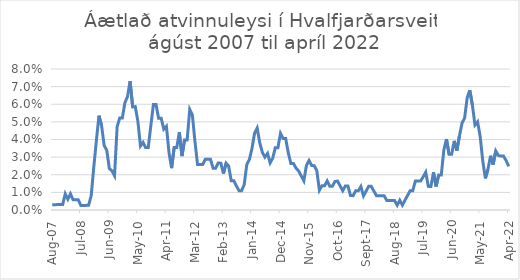
| Category | Áætlað atvinnuleysi |
|---|---|
| 2007-08-01 | 0.003 |
| 2007-09-01 | 0.003 |
| 2007-10-01 | 0.003 |
| 2007-11-01 | 0.003 |
| 2007-12-01 | 0.003 |
| 2008-01-01 | 0.009 |
| 2008-02-01 | 0.006 |
| 2008-03-01 | 0.009 |
| 2008-04-01 | 0.006 |
| 2008-05-01 | 0.006 |
| 2008-06-01 | 0.006 |
| 2008-07-01 | 0.003 |
| 2008-08-01 | 0.003 |
| 2008-09-01 | 0.003 |
| 2008-10-01 | 0.003 |
| 2008-11-01 | 0.008 |
| 2008-12-01 | 0.024 |
| 2009-01-01 | 0.039 |
| 2009-02-01 | 0.054 |
| 2009-03-01 | 0.048 |
| 2009-04-01 | 0.037 |
| 2009-05-01 | 0.034 |
| 2009-06-01 | 0.023 |
| 2009-07-01 | 0.022 |
| 2009-08-01 | 0.019 |
| 2009-09-01 | 0.047 |
| 2009-10-01 | 0.052 |
| 2009-11-01 | 0.052 |
| 2009-12-01 | 0.061 |
| 2010-01-01 | 0.064 |
| 2010-02-01 | 0.073 |
| 2010-03-01 | 0.058 |
| 2010-04-01 | 0.059 |
| 2010-05-01 | 0.05 |
| 2010-06-01 | 0.036 |
| 2010-07-01 | 0.038 |
| 2010-08-01 | 0.035 |
| 2010-09-01 | 0.035 |
| 2010-10-01 | 0.048 |
| 2010-11-01 | 0.06 |
| 2010-12-01 | 0.06 |
| 2011-01-01 | 0.052 |
| 2011-02-01 | 0.052 |
| 2011-03-01 | 0.046 |
| 2011-04-01 | 0.047 |
| 2011-05-01 | 0.033 |
| 2011-06-01 | 0.024 |
| 2011-07-01 | 0.035 |
| 2011-08-01 | 0.035 |
| 2011-09-01 | 0.044 |
| 2011-10-01 | 0.031 |
| 2011-11-01 | 0.04 |
| 2011-12-01 | 0.04 |
| 2012-01-01 | 0.057 |
| 2012-02-01 | 0.054 |
| 2012-03-01 | 0.039 |
| 2012-04-01 | 0.026 |
| 2012-05-01 | 0.026 |
| 2012-06-01 | 0.026 |
| 2012-07-01 | 0.029 |
| 2012-08-01 | 0.029 |
| 2012-09-01 | 0.029 |
| 2012-10-01 | 0.024 |
| 2012-11-01 | 0.024 |
| 2012-12-01 | 0.027 |
| 2013-01-01 | 0.027 |
| 2013-02-01 | 0.021 |
| 2013-03-01 | 0.027 |
| 2013-04-01 | 0.025 |
| 2013-05-01 | 0.017 |
| 2013-06-01 | 0.017 |
| 2013-07-01 | 0.014 |
| 2013-08-01 | 0.011 |
| 2013-09-01 | 0.011 |
| 2013-10-01 | 0.014 |
| 2013-11-01 | 0.026 |
| 2013-12-01 | 0.029 |
| 2014-01-01 | 0.035 |
| 2014-02-01 | 0.044 |
| 2014-03-01 | 0.047 |
| 2014-04-01 | 0.038 |
| 2014-05-01 | 0.033 |
| 2014-06-01 | 0.03 |
| 2014-07-01 | 0.032 |
| 2014-08-01 | 0.027 |
| 2014-09-01 | 0.029 |
| 2014-10-01 | 0.035 |
| 2014-11-01 | 0.035 |
| 2014-12-01 | 0.043 |
| 2015-01-01 | 0.041 |
| 2015-02-01 | 0.041 |
| 2015-03-01 | 0.032 |
| 2015-04-01 | 0.026 |
| 2015-05-01 | 0.026 |
| 2015-06-01 | 0.024 |
| 2015-07-01 | 0.022 |
| 2015-08-01 | 0.019 |
| 2015-09-01 | 0.017 |
| 2015-10-01 | 0.025 |
| 2015-11-01 | 0.028 |
| 2015-12-01 | 0.025 |
| 2016-01-01 | 0.025 |
| 2016-02-01 | 0.022 |
| 2016-03-01 | 0.011 |
| 2016-04-01 | 0.014 |
| 2016-05-01 | 0.014 |
| 2016-06-01 | 0.016 |
| 2016-07-01 | 0.013 |
| 2016-08-01 | 0.013 |
| 2016-09-01 | 0.016 |
| 2016-10-01 | 0.016 |
| 2016-11-01 | 0.014 |
| 2016-12-01 | 0.011 |
| 2017-01-01 | 0.014 |
| 2017-02-01 | 0.014 |
| 2017-03-01 | 0.008 |
| 2017-04-01 | 0.008 |
| 2017-05-01 | 0.011 |
| 2017-06-01 | 0.011 |
| 2017-07-01 | 0.013 |
| 2017-08-01 | 0.008 |
| 2017-09-01 | 0.011 |
| 2017-10-01 | 0.013 |
| 2017-11-01 | 0.013 |
| 2017-12-01 | 0.011 |
| 2018-01-01 | 0.008 |
| 2018-02-01 | 0.008 |
| 2018-03-01 | 0.008 |
| 2018-04-01 | 0.008 |
| 2018-05-01 | 0.005 |
| 2018-06-01 | 0.005 |
| 2018-07-01 | 0.005 |
| 2018-08-01 | 0.005 |
| 2018-09-01 | 0.003 |
| 2018-10-01 | 0.006 |
| 2018-11-01 | 0.003 |
| 2018-12-01 | 0.006 |
| 2019-01-01 | 0.008 |
| 2019-02-01 | 0.011 |
| 2019-03-01 | 0.011 |
| 2019-04-01 | 0.016 |
| 2019-05-01 | 0.016 |
| 2019-06-01 | 0.016 |
| 2019-07-01 | 0.019 |
| 2019-08-01 | 0.021 |
| 2019-09-01 | 0.013 |
| 2019-10-01 | 0.013 |
| 2019-11-01 | 0.021 |
| 2019-12-01 | 0.013 |
| 2020-01-01 | 0.02 |
| 2020-02-01 | 0.02 |
| 2020-03-01 | 0.034 |
| 2020-04-01 | 0.04 |
| 2020-05-01 | 0.032 |
| 2020-06-01 | 0.032 |
| 2020-07-01 | 0.039 |
| 2020-08-01 | 0.034 |
| 2020-09-01 | 0.042 |
| 2020-10-01 | 0.049 |
| 2020-11-01 | 0.052 |
| 2020-12-01 | 0.064 |
| 2021-01-01 | 0.068 |
| 2021-02-01 | 0.059 |
| 2021-03-01 | 0.048 |
| 2021-04-01 | 0.05 |
| 2021-05-01 | 0.042 |
| 2021-06-01 | 0.028 |
| 2021-07-01 | 0.018 |
| 2021-08-01 | 0.023 |
| 2021-09-01 | 0.031 |
| 2021-10-01 | 0.026 |
| 2021-11-01 | 0.034 |
| 2021-12-01 | 0.031 |
| 2022-01-01 | 0.031 |
| 2022-02-01 | 0.031 |
| 2022-03-01 | 0.028 |
| 2022-04-01 | 0.025 |